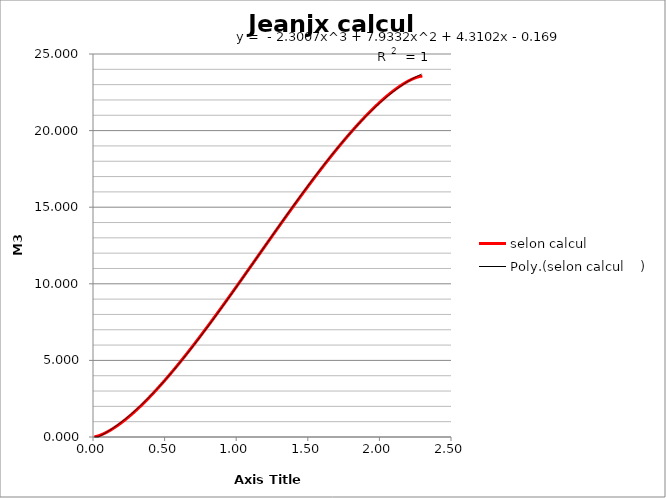
| Category | selon calcul |
|---|---|
| 0.01 | 0.01 |
| 0.02 | 0.03 |
| 0.03 | 0.054 |
| 0.04 | 0.084 |
| 0.05 | 0.118 |
| 0.06 | 0.155 |
| 0.07 | 0.195 |
| 0.08 | 0.239 |
| 0.09 | 0.285 |
| 0.1 | 0.334 |
| 0.11 | 0.386 |
| 0.12 | 0.44 |
| 0.13 | 0.496 |
| 0.14 | 0.554 |
| 0.15 | 0.615 |
| 0.16 | 0.677 |
| 0.17 | 0.742 |
| 0.18 | 0.808 |
| 0.19 | 0.877 |
| 0.2 | 0.947 |
| 0.21 | 1.019 |
| 0.22 | 1.092 |
| 0.23 | 1.167 |
| 0.24 | 1.244 |
| 0.25 | 1.322 |
| 0.26 | 1.402 |
| 0.27 | 1.483 |
| 0.28 | 1.565 |
| 0.29 | 1.649 |
| 0.3 | 1.735 |
| 0.31 | 1.821 |
| 0.32 | 1.909 |
| 0.33 | 1.998 |
| 0.34 | 2.089 |
| 0.35 | 2.18 |
| 0.36 | 2.273 |
| 0.37 | 2.367 |
| 0.38 | 2.462 |
| 0.39 | 2.558 |
| 0.4 | 2.655 |
| 0.41 | 2.754 |
| 0.42 | 2.853 |
| 0.43 | 2.953 |
| 0.44 | 3.055 |
| 0.45 | 3.157 |
| 0.46 | 3.26 |
| 0.47 | 3.364 |
| 0.48 | 3.469 |
| 0.49 | 3.575 |
| 0.5 | 3.682 |
| 0.51 | 3.79 |
| 0.52 | 3.898 |
| 0.53 | 4.008 |
| 0.54 | 4.118 |
| 0.55 | 4.229 |
| 0.56 | 4.341 |
| 0.57 | 4.453 |
| 0.58 | 4.566 |
| 0.59 | 4.68 |
| 0.6 | 4.795 |
| 0.61 | 4.91 |
| 0.62 | 5.026 |
| 0.63 | 5.143 |
| 0.64 | 5.26 |
| 0.65 | 5.378 |
| 0.66 | 5.496 |
| 0.67 | 5.615 |
| 0.68 | 5.735 |
| 0.69 | 5.855 |
| 0.7 | 5.976 |
| 0.71 | 6.097 |
| 0.72 | 6.219 |
| 0.73 | 6.342 |
| 0.74 | 6.464 |
| 0.75 | 6.588 |
| 0.76 | 6.712 |
| 0.77 | 6.836 |
| 0.78 | 6.961 |
| 0.79 | 7.086 |
| 0.8 | 7.211 |
| 0.81 | 7.337 |
| 0.82 | 7.464 |
| 0.83 | 7.591 |
| 0.84 | 7.718 |
| 0.85 | 7.845 |
| 0.86 | 7.973 |
| 0.87 | 8.101 |
| 0.88 | 8.23 |
| 0.89 | 8.359 |
| 0.9 | 8.488 |
| 0.91 | 8.617 |
| 0.92 | 8.747 |
| 0.93 | 8.877 |
| 0.94 | 9.007 |
| 0.95 | 9.138 |
| 0.96 | 9.268 |
| 0.97 | 9.399 |
| 0.98 | 9.53 |
| 0.99 | 9.662 |
| 1.0 | 9.793 |
| 1.01 | 9.925 |
| 1.02 | 10.057 |
| 1.03 | 10.189 |
| 1.04 | 10.321 |
| 1.05 | 10.453 |
| 1.06 | 10.585 |
| 1.07 | 10.718 |
| 1.08 | 10.85 |
| 1.09 | 10.983 |
| 1.1 | 11.115 |
| 1.11 | 11.248 |
| 1.12 | 11.381 |
| 1.13 | 11.514 |
| 1.14 | 11.646 |
| 1.15 | 11.779 |
| 1.16 | 11.912 |
| 1.17 | 12.045 |
| 1.18 | 12.178 |
| 1.19 | 12.311 |
| 1.2 | 12.443 |
| 1.21 | 12.576 |
| 1.22 | 12.709 |
| 1.23 | 12.841 |
| 1.24 | 12.973 |
| 1.25 | 13.106 |
| 1.26 | 13.238 |
| 1.27 | 13.37 |
| 1.28 | 13.502 |
| 1.29 | 13.634 |
| 1.3 | 13.766 |
| 1.31 | 13.897 |
| 1.32 | 14.028 |
| 1.33 | 14.159 |
| 1.34 | 14.29 |
| 1.35 | 14.421 |
| 1.36 | 14.551 |
| 1.37 | 14.682 |
| 1.38 | 14.812 |
| 1.39 | 14.941 |
| 1.4 | 15.071 |
| 1.41 | 15.2 |
| 1.42 | 15.329 |
| 1.43 | 15.457 |
| 1.44 | 15.585 |
| 1.45 | 15.713 |
| 1.46 | 15.841 |
| 1.47 | 15.968 |
| 1.48 | 16.095 |
| 1.49 | 16.221 |
| 1.5 | 16.347 |
| 1.51 | 16.473 |
| 1.52 | 16.598 |
| 1.53 | 16.723 |
| 1.54 | 16.847 |
| 1.55 | 16.971 |
| 1.56 | 17.094 |
| 1.57 | 17.217 |
| 1.58 | 17.34 |
| 1.59 | 17.461 |
| 1.6 | 17.583 |
| 1.61 | 17.704 |
| 1.62 | 17.824 |
| 1.63 | 17.943 |
| 1.64 | 18.063 |
| 1.65 | 18.181 |
| 1.66 | 18.299 |
| 1.67 | 18.416 |
| 1.68 | 18.533 |
| 1.69 | 18.649 |
| 1.7 | 18.764 |
| 1.71 | 18.879 |
| 1.72 | 18.993 |
| 1.73 | 19.106 |
| 1.74 | 19.218 |
| 1.75 | 19.33 |
| 1.76 | 19.441 |
| 1.77 | 19.551 |
| 1.78 | 19.66 |
| 1.79 | 19.769 |
| 1.8 | 19.876 |
| 1.81 | 19.983 |
| 1.82 | 20.089 |
| 1.83 | 20.194 |
| 1.84 | 20.299 |
| 1.85 | 20.402 |
| 1.86 | 20.504 |
| 1.87 | 20.605 |
| 1.88 | 20.706 |
| 1.89 | 20.805 |
| 1.9 | 20.903 |
| 1.91 | 21.001 |
| 1.92 | 21.097 |
| 1.93 | 21.192 |
| 1.94 | 21.286 |
| 1.95 | 21.378 |
| 1.96 | 21.47 |
| 1.97 | 21.56 |
| 1.98 | 21.65 |
| 1.99 | 21.738 |
| 2.0 | 21.824 |
| 2.01 | 21.909 |
| 2.02 | 21.993 |
| 2.03 | 22.076 |
| 2.04 | 22.157 |
| 2.05 | 22.237 |
| 2.06 | 22.315 |
| 2.07 | 22.392 |
| 2.08 | 22.467 |
| 2.09 | 22.54 |
| 2.1 | 22.612 |
| 2.11 | 22.682 |
| 2.12 | 22.75 |
| 2.13 | 22.817 |
| 2.14 | 22.881 |
| 2.15 | 22.944 |
| 2.16 | 23.004 |
| 2.17 | 23.063 |
| 2.18 | 23.119 |
| 2.19 | 23.173 |
| 2.2 | 23.225 |
| 2.21 | 23.274 |
| 2.22 | 23.32 |
| 2.23 | 23.363 |
| 2.24 | 23.404 |
| 2.25 | 23.441 |
| 2.26 | 23.475 |
| 2.27 | 23.504 |
| 2.28 | 23.529 |
| 2.29 | 23.548 |
| 2.3 | 23.559 |